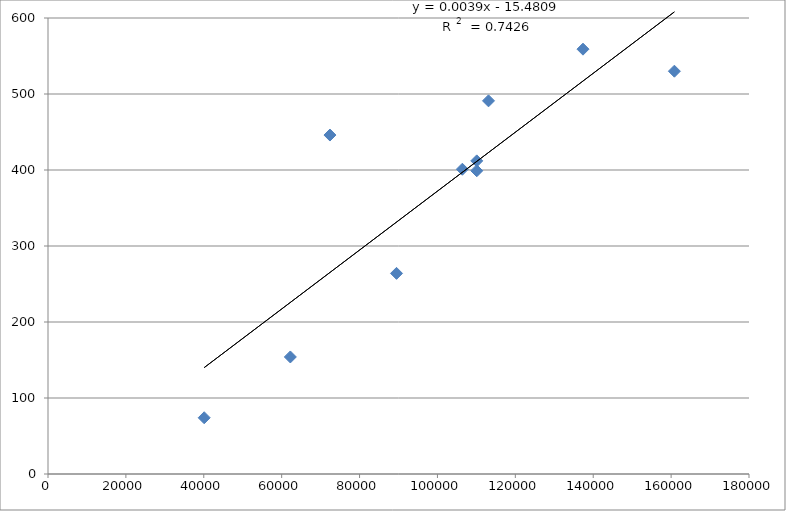
| Category | Series 0 |
|---|---|
| 40107.0 | 74 |
| 106394.0 | 401 |
| 89491.0 | 264 |
| 62226.0 | 154 |
| 110095.0 | 399 |
| 110095.0 | 412 |
| 113113.0 | 491 |
| 137372.0 | 559 |
| 160842.0 | 530 |
| 72396.0 | 446 |